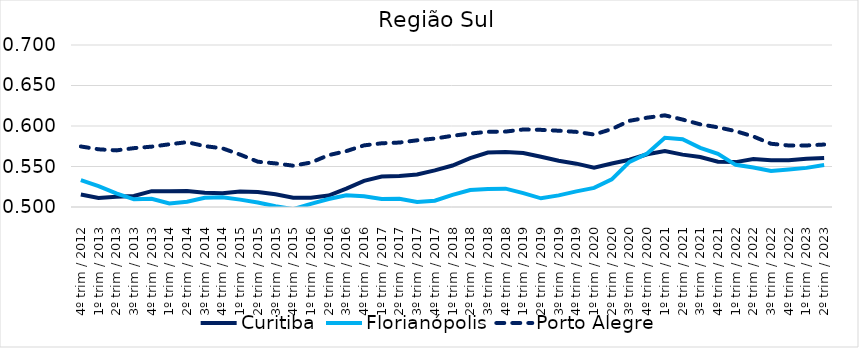
| Category | Curitiba | Florianópolis | Porto Alegre |
|---|---|---|---|
| 4º trim / 2012 | 0.515 | 0.533 | 0.575 |
| 1º trim / 2013 | 0.511 | 0.526 | 0.571 |
| 2º trim / 2013 | 0.513 | 0.517 | 0.57 |
| 3º trim / 2013 | 0.514 | 0.509 | 0.573 |
| 4º trim / 2013 | 0.52 | 0.51 | 0.575 |
| 1º trim / 2014 | 0.519 | 0.504 | 0.577 |
| 2º trim / 2014 | 0.52 | 0.506 | 0.58 |
| 3º trim / 2014 | 0.518 | 0.511 | 0.575 |
| 4º trim / 2014 | 0.517 | 0.512 | 0.572 |
| 1º trim / 2015 | 0.519 | 0.509 | 0.565 |
| 2º trim / 2015 | 0.518 | 0.506 | 0.556 |
| 3º trim / 2015 | 0.516 | 0.501 | 0.554 |
| 4º trim / 2015 | 0.511 | 0.497 | 0.551 |
| 1º trim / 2016 | 0.511 | 0.504 | 0.555 |
| 2º trim / 2016 | 0.514 | 0.51 | 0.564 |
| 3º trim / 2016 | 0.523 | 0.515 | 0.569 |
| 4º trim / 2016 | 0.532 | 0.513 | 0.576 |
| 1º trim / 2017 | 0.538 | 0.51 | 0.579 |
| 2º trim / 2017 | 0.538 | 0.51 | 0.58 |
| 3º trim / 2017 | 0.54 | 0.506 | 0.582 |
| 4º trim / 2017 | 0.545 | 0.508 | 0.585 |
| 1º trim / 2018 | 0.551 | 0.515 | 0.588 |
| 2º trim / 2018 | 0.56 | 0.521 | 0.591 |
| 3º trim / 2018 | 0.567 | 0.522 | 0.593 |
| 4º trim / 2018 | 0.568 | 0.523 | 0.593 |
| 1º trim / 2019 | 0.567 | 0.517 | 0.596 |
| 2º trim / 2019 | 0.562 | 0.511 | 0.595 |
| 3º trim / 2019 | 0.557 | 0.514 | 0.594 |
| 4º trim / 2019 | 0.553 | 0.519 | 0.593 |
| 1º trim / 2020 | 0.548 | 0.524 | 0.589 |
| 2º trim / 2020 | 0.554 | 0.534 | 0.596 |
| 3º trim / 2020 | 0.558 | 0.556 | 0.606 |
| 4º trim / 2020 | 0.565 | 0.566 | 0.61 |
| 1º trim / 2021 | 0.569 | 0.585 | 0.613 |
| 2º trim / 2021 | 0.565 | 0.584 | 0.608 |
| 3º trim / 2021 | 0.562 | 0.573 | 0.602 |
| 4º trim / 2021 | 0.556 | 0.566 | 0.598 |
| 1º trim / 2022 | 0.555 | 0.552 | 0.594 |
| 2º trim / 2022 | 0.559 | 0.549 | 0.587 |
| 3º trim / 2022 | 0.558 | 0.544 | 0.578 |
| 4º trim / 2022 | 0.558 | 0.546 | 0.576 |
| 1º trim / 2023 | 0.56 | 0.548 | 0.576 |
| 2º trim / 2023 | 0.56 | 0.552 | 0.577 |